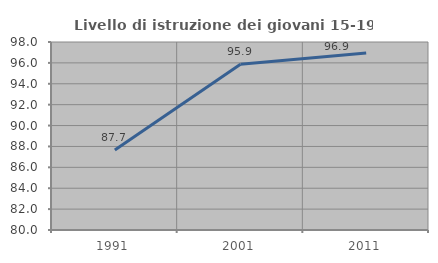
| Category | Livello di istruzione dei giovani 15-19 anni |
|---|---|
| 1991.0 | 87.654 |
| 2001.0 | 95.86 |
| 2011.0 | 96.947 |